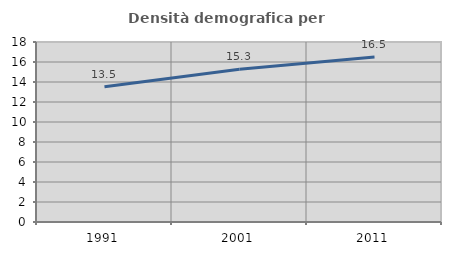
| Category | Densità demografica |
|---|---|
| 1991.0 | 13.534 |
| 2001.0 | 15.275 |
| 2011.0 | 16.494 |